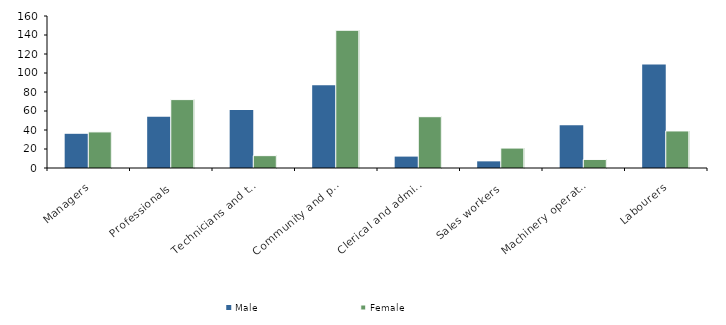
| Category | Male | Female |
|---|---|---|
| Managers | 36 | 38 |
| Professionals | 54 | 72 |
| Technicians and trades workers | 61 | 13 |
| Community and personal service workers | 87 | 145 |
| Clerical and administrative workers | 12 | 54 |
| Sales workers | 7 | 21 |
| Machinery operators and drivers | 45 | 9 |
| Labourers | 109 | 39 |